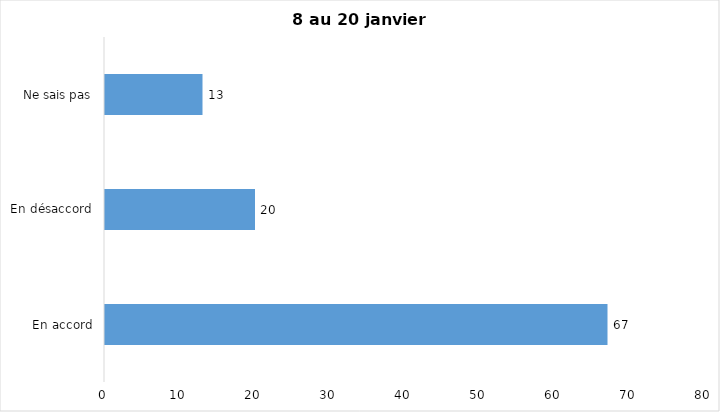
| Category | J’ai l’intention de recevoir le vaccin contre la COVID-19 lorsqu’il
sera disponible |
|---|---|
| En accord | 67 |
| En désaccord | 20 |
| Ne sais pas | 13 |